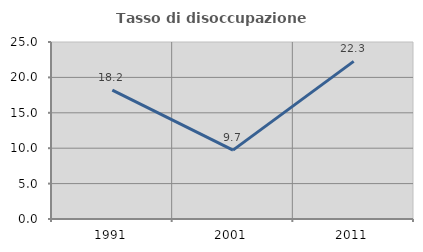
| Category | Tasso di disoccupazione giovanile  |
|---|---|
| 1991.0 | 18.198 |
| 2001.0 | 9.73 |
| 2011.0 | 22.263 |